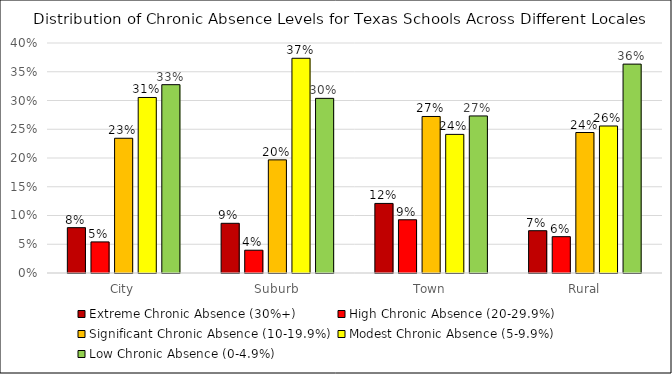
| Category | Extreme Chronic Absence (30%+) | High Chronic Absence (20-29.9%) | Significant Chronic Absence (10-19.9%) | Modest Chronic Absence (5-9.9%) | Low Chronic Absence (0-4.9%) |
|---|---|---|---|---|---|
| City | 0.079 | 0.054 | 0.234 | 0.305 | 0.328 |
| Suburb | 0.086 | 0.04 | 0.197 | 0.373 | 0.304 |
| Town | 0.121 | 0.093 | 0.272 | 0.241 | 0.273 |
| Rural | 0.074 | 0.063 | 0.244 | 0.256 | 0.363 |